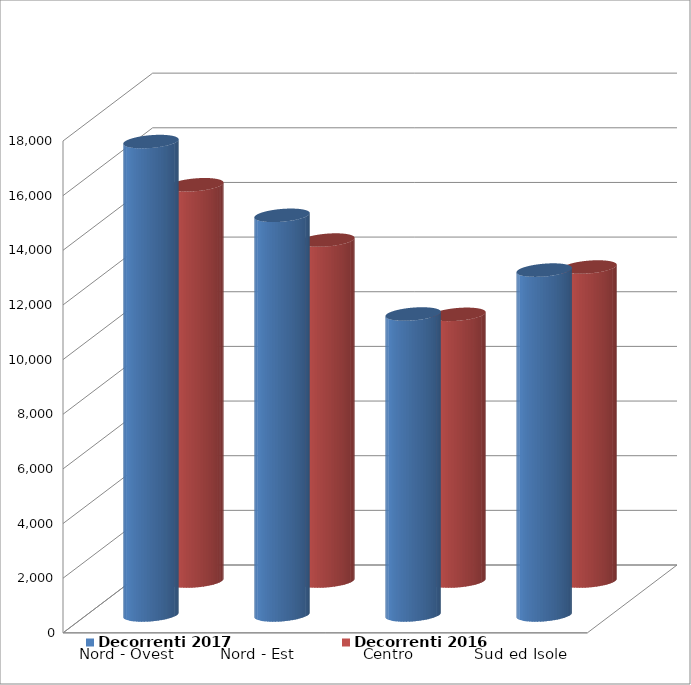
| Category | Decorrenti 2017 | Decorrenti 2016 |
|---|---|---|
| Nord - Ovest | 17323 | 14501 |
| Nord - Est | 14624 | 12477 |
| Centro | 11013 | 9759 |
| Sud ed Isole | 12620 | 11491 |